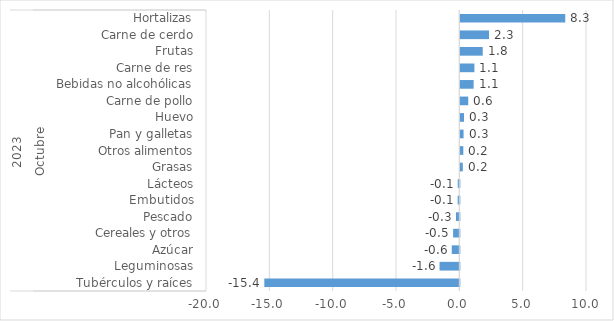
| Category | Total |
|---|---|
| 0 | -15.397 |
| 1 | -1.563 |
| 2 | -0.597 |
| 3 | -0.491 |
| 4 | -0.266 |
| 5 | -0.134 |
| 6 | -0.124 |
| 7 | 0.197 |
| 8 | 0.237 |
| 9 | 0.256 |
| 10 | 0.289 |
| 11 | 0.624 |
| 12 | 1.051 |
| 13 | 1.11 |
| 14 | 1.767 |
| 15 | 2.267 |
| 16 | 8.284 |